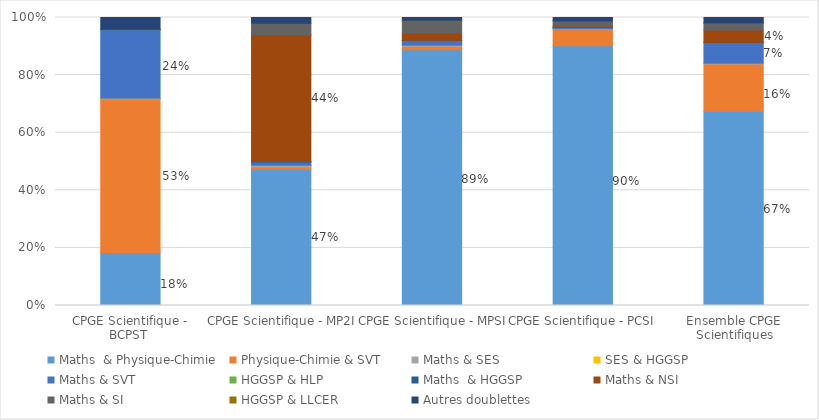
| Category | Maths  & Physique-Chimie  | Physique-Chimie & SVT | Maths & SES | SES & HGGSP | Maths & SVT | HGGSP & HLP | Maths  & HGGSP | Maths & NSI | Maths & SI | HGGSP & LLCER | Autres doublettes |
|---|---|---|---|---|---|---|---|---|---|---|---|
| CPGE Scientifique - BCPST  | 0.184 | 0.534 | 0.002 | 0.001 | 0.238 | 0 | 0 | 0.001 | 0.001 | 0 | 0.04 |
| CPGE Scientifique - MP2I  | 0.473 | 0.008 | 0.006 | 0 | 0.011 | 0 | 0.002 | 0.439 | 0.041 | 0 | 0.02 |
| CPGE Scientifique - MPSI  | 0.888 | 0.012 | 0.003 | 0 | 0.016 | 0 | 0.002 | 0.026 | 0.043 | 0 | 0.01 |
| CPGE Scientifique - PCSI  | 0.902 | 0.057 | 0.001 | 0 | 0.005 | 0 | 0 | 0.004 | 0.017 | 0 | 0.012 |
| Ensemble CPGE Scientifiques | 0.674 | 0.164 | 0.002 | 0 | 0.072 | 0 | 0.001 | 0.042 | 0.024 | 0 | 0.019 |